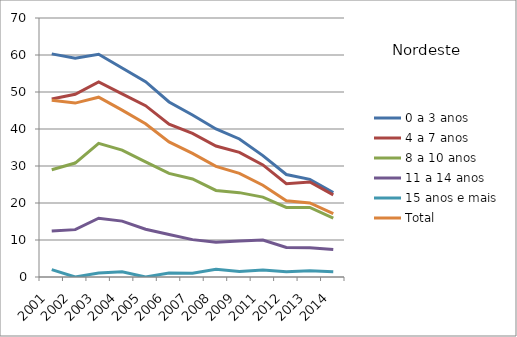
| Category | 0 a 3 anos | 4 a 7 anos | 8 a 10 anos | 11 a 14 anos | 15 anos e mais | Total |
|---|---|---|---|---|---|---|
| 2001.0 | 60.3 | 48.1 | 29 | 12.4 | 2 | 47.8 |
| 2002.0 | 59.1 | 49.4 | 30.8 | 12.8 | 0 | 47 |
| 2003.0 | 60.2 | 52.7 | 36.1 | 15.9 | 1.1 | 48.6 |
| 2004.0 | 56.5 | 49.5 | 34.3 | 15.1 | 1.4 | 45.1 |
| 2005.0 | 52.8 | 46.3 | 31.1 | 12.9 | 0 | 41.4 |
| 2006.0 | 47.3 | 41.3 | 28 | 11.5 | 1.1 | 36.5 |
| 2007.0 | 43.8 | 38.8 | 26.5 | 10.1 | 1 | 33.4 |
| 2008.0 | 40 | 35.4 | 23.4 | 9.4 | 2.1 | 29.9 |
| 2009.0 | 37.3 | 33.7 | 22.8 | 9.7 | 1.5 | 28 |
| 2011.0 | 32.8 | 30.3 | 21.6 | 10 | 1.9 | 24.8 |
| 2012.0 | 27.7 | 25.2 | 18.8 | 8 | 1.4 | 20.6 |
| 2013.0 | 26.4 | 25.7 | 18.8 | 7.9 | 1.7 | 20 |
| 2014.0 | 22.8 | 22.2 | 15.9 | 7.4 | 1.4 | 17.1 |